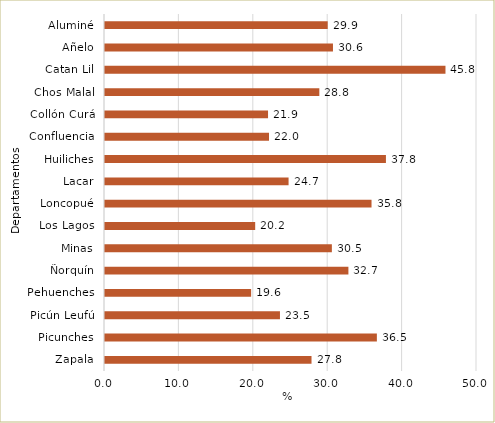
| Category | Aluminé |
|---|---|
| Aluminé | 29.934 |
| Añelo | 30.641 |
| Catan Lil | 45.763 |
| Chos Malal | 28.808 |
| Collón Curá | 21.914 |
| Confluencia | 22.045 |
| Huiliches | 37.76 |
| Lacar | 24.673 |
| Loncopué | 35.823 |
| Los Lagos | 20.187 |
| Minas | 30.493 |
| Ñorquín | 32.716 |
| Pehuenches | 19.641 |
| Picún Leufú | 23.516 |
| Picunches | 36.541 |
| Zapala | 27.758 |